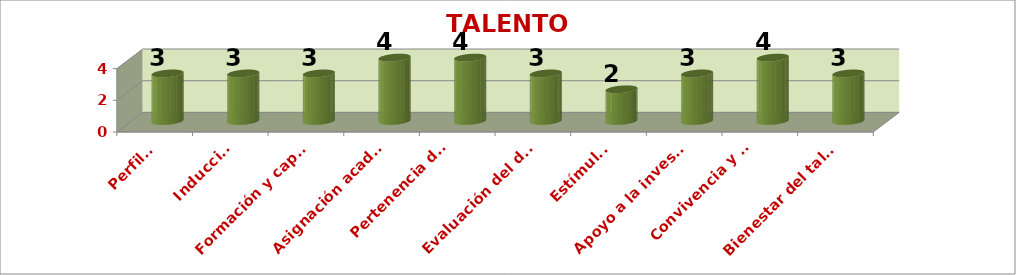
| Category | TALENTO HUMANO |
|---|---|
| Perfiles | 3 |
| Inducción | 3 |
| Formación y capacitación | 3 |
| Asignación académica | 4 |
| Pertenencia del personal
vinculado | 4 |
| Evaluación del desempeño | 3 |
| Estímulos | 2 |
| Apoyo a la investigación | 3 |
| Convivencia y manejo de
conflictos | 4 |
| Bienestar del talento humano | 3 |